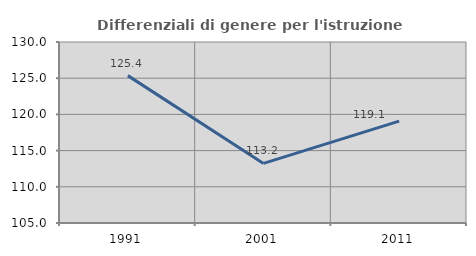
| Category | Differenziali di genere per l'istruzione superiore |
|---|---|
| 1991.0 | 125.355 |
| 2001.0 | 113.228 |
| 2011.0 | 119.072 |